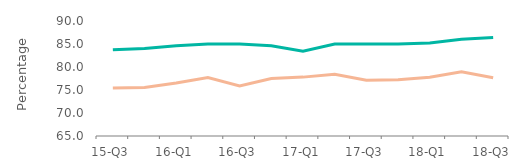
| Category | First-time
buyers | Home movers |
|---|---|---|
| 15-Q3 | 83.745 | 75.41 |
| 15-Q4 | 84.04 | 75.55 |
| 16-Q1 | 84.64 | 76.52 |
| 16-Q2 | 85.01 | 77.71 |
| 16-Q3 | 85 | 75.88 |
| 16-Q4 | 84.62 | 77.51 |
| 17-Q1 | 83.45 | 77.8 |
| 17-Q2 | 85 | 78.415 |
| 17-Q3 | 85 | 77.14 |
| 17-Q4 | 85 | 77.24 |
| 18-Q1 | 85.22 | 77.78 |
| 18-Q2 | 86.03 | 78.97 |
| 18-Q3 | 86.4 | 77.65 |